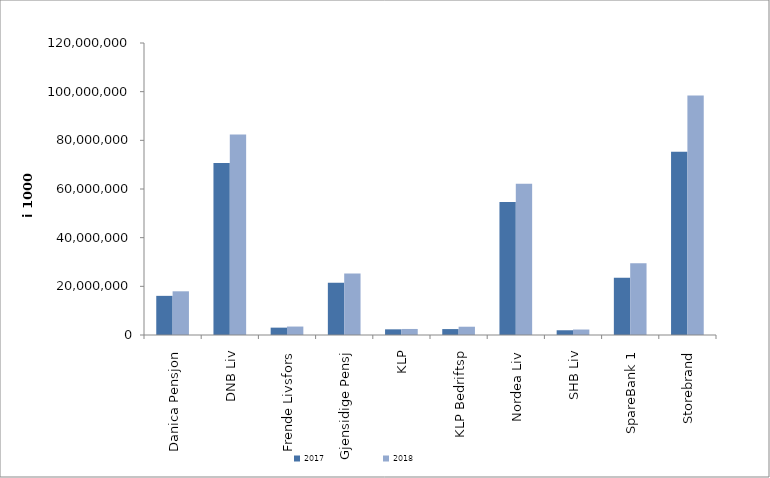
| Category | 2017 | 2018 |
|---|---|---|
| Danica Pensjon | 16087298.015 | 17958434.743 |
| DNB Liv | 70689761 | 82380384 |
| Frende Livsfors | 3022527.8 | 3471864 |
| Gjensidige Pensj | 21451220.49 | 25237226 |
| KLP | 2330198.916 | 2478827.297 |
| KLP Bedriftsp | 2432471 | 3400155 |
| Nordea Liv | 54647570 | 62133840 |
| SHB Liv | 1949500 | 2249653.412 |
| SpareBank 1 | 23504999.904 | 29524731.952 |
| Storebrand | 75354538.838 | 98437461.06 |